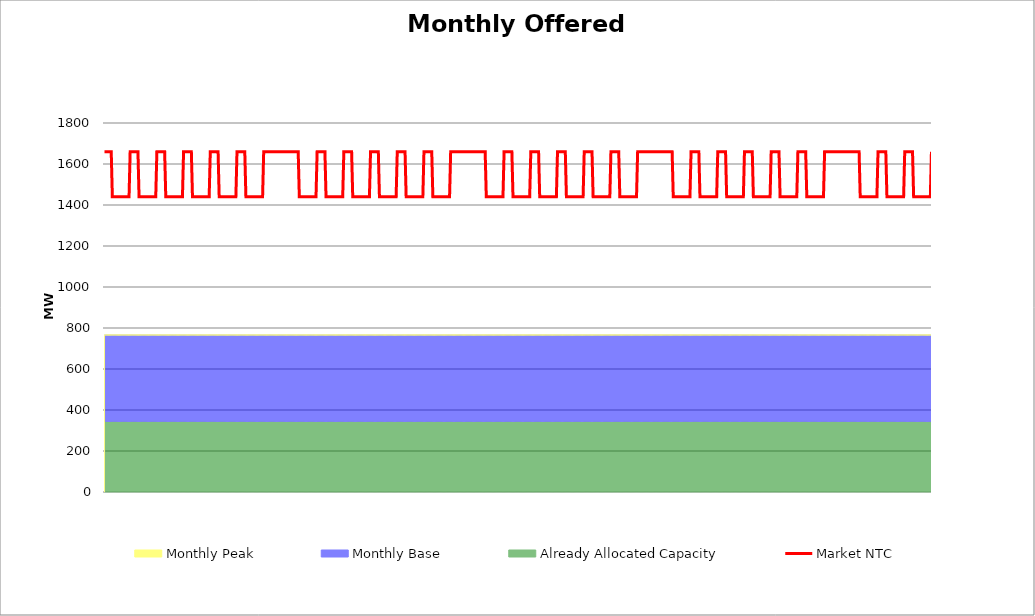
| Category | Market NTC |
|---|---|
| 0 | 1660 |
| 1 | 1660 |
| 2 | 1660 |
| 3 | 1660 |
| 4 | 1660 |
| 5 | 1660 |
| 6 | 1660 |
| 7 | 1440 |
| 8 | 1440 |
| 9 | 1440 |
| 10 | 1440 |
| 11 | 1440 |
| 12 | 1440 |
| 13 | 1440 |
| 14 | 1440 |
| 15 | 1440 |
| 16 | 1440 |
| 17 | 1440 |
| 18 | 1440 |
| 19 | 1440 |
| 20 | 1440 |
| 21 | 1440 |
| 22 | 1440 |
| 23 | 1660 |
| 24 | 1660 |
| 25 | 1660 |
| 26 | 1660 |
| 27 | 1660 |
| 28 | 1660 |
| 29 | 1660 |
| 30 | 1660 |
| 31 | 1440 |
| 32 | 1440 |
| 33 | 1440 |
| 34 | 1440 |
| 35 | 1440 |
| 36 | 1440 |
| 37 | 1440 |
| 38 | 1440 |
| 39 | 1440 |
| 40 | 1440 |
| 41 | 1440 |
| 42 | 1440 |
| 43 | 1440 |
| 44 | 1440 |
| 45 | 1440 |
| 46 | 1440 |
| 47 | 1660 |
| 48 | 1660 |
| 49 | 1660 |
| 50 | 1660 |
| 51 | 1660 |
| 52 | 1660 |
| 53 | 1660 |
| 54 | 1660 |
| 55 | 1440 |
| 56 | 1440 |
| 57 | 1440 |
| 58 | 1440 |
| 59 | 1440 |
| 60 | 1440 |
| 61 | 1440 |
| 62 | 1440 |
| 63 | 1440 |
| 64 | 1440 |
| 65 | 1440 |
| 66 | 1440 |
| 67 | 1440 |
| 68 | 1440 |
| 69 | 1440 |
| 70 | 1440 |
| 71 | 1660 |
| 72 | 1660 |
| 73 | 1660 |
| 74 | 1660 |
| 75 | 1660 |
| 76 | 1660 |
| 77 | 1660 |
| 78 | 1660 |
| 79 | 1440 |
| 80 | 1440 |
| 81 | 1440 |
| 82 | 1440 |
| 83 | 1440 |
| 84 | 1440 |
| 85 | 1440 |
| 86 | 1440 |
| 87 | 1440 |
| 88 | 1440 |
| 89 | 1440 |
| 90 | 1440 |
| 91 | 1440 |
| 92 | 1440 |
| 93 | 1440 |
| 94 | 1440 |
| 95 | 1660 |
| 96 | 1660 |
| 97 | 1660 |
| 98 | 1660 |
| 99 | 1660 |
| 100 | 1660 |
| 101 | 1660 |
| 102 | 1660 |
| 103 | 1440 |
| 104 | 1440 |
| 105 | 1440 |
| 106 | 1440 |
| 107 | 1440 |
| 108 | 1440 |
| 109 | 1440 |
| 110 | 1440 |
| 111 | 1440 |
| 112 | 1440 |
| 113 | 1440 |
| 114 | 1440 |
| 115 | 1440 |
| 116 | 1440 |
| 117 | 1440 |
| 118 | 1440 |
| 119 | 1660 |
| 120 | 1660 |
| 121 | 1660 |
| 122 | 1660 |
| 123 | 1660 |
| 124 | 1660 |
| 125 | 1660 |
| 126 | 1660 |
| 127 | 1440 |
| 128 | 1440 |
| 129 | 1440 |
| 130 | 1440 |
| 131 | 1440 |
| 132 | 1440 |
| 133 | 1440 |
| 134 | 1440 |
| 135 | 1440 |
| 136 | 1440 |
| 137 | 1440 |
| 138 | 1440 |
| 139 | 1440 |
| 140 | 1440 |
| 141 | 1440 |
| 142 | 1440 |
| 143 | 1660 |
| 144 | 1660 |
| 145 | 1660 |
| 146 | 1660 |
| 147 | 1660 |
| 148 | 1660 |
| 149 | 1660 |
| 150 | 1660 |
| 151 | 1660 |
| 152 | 1660 |
| 153 | 1660 |
| 154 | 1660 |
| 155 | 1660 |
| 156 | 1660 |
| 157 | 1660 |
| 158 | 1660 |
| 159 | 1660 |
| 160 | 1660 |
| 161 | 1660 |
| 162 | 1660 |
| 163 | 1660 |
| 164 | 1660 |
| 165 | 1660 |
| 166 | 1660 |
| 167 | 1660 |
| 168 | 1660 |
| 169 | 1660 |
| 170 | 1660 |
| 171 | 1660 |
| 172 | 1660 |
| 173 | 1660 |
| 174 | 1660 |
| 175 | 1440 |
| 176 | 1440 |
| 177 | 1440 |
| 178 | 1440 |
| 179 | 1440 |
| 180 | 1440 |
| 181 | 1440 |
| 182 | 1440 |
| 183 | 1440 |
| 184 | 1440 |
| 185 | 1440 |
| 186 | 1440 |
| 187 | 1440 |
| 188 | 1440 |
| 189 | 1440 |
| 190 | 1440 |
| 191 | 1660 |
| 192 | 1660 |
| 193 | 1660 |
| 194 | 1660 |
| 195 | 1660 |
| 196 | 1660 |
| 197 | 1660 |
| 198 | 1660 |
| 199 | 1440 |
| 200 | 1440 |
| 201 | 1440 |
| 202 | 1440 |
| 203 | 1440 |
| 204 | 1440 |
| 205 | 1440 |
| 206 | 1440 |
| 207 | 1440 |
| 208 | 1440 |
| 209 | 1440 |
| 210 | 1440 |
| 211 | 1440 |
| 212 | 1440 |
| 213 | 1440 |
| 214 | 1440 |
| 215 | 1660 |
| 216 | 1660 |
| 217 | 1660 |
| 218 | 1660 |
| 219 | 1660 |
| 220 | 1660 |
| 221 | 1660 |
| 222 | 1660 |
| 223 | 1440 |
| 224 | 1440 |
| 225 | 1440 |
| 226 | 1440 |
| 227 | 1440 |
| 228 | 1440 |
| 229 | 1440 |
| 230 | 1440 |
| 231 | 1440 |
| 232 | 1440 |
| 233 | 1440 |
| 234 | 1440 |
| 235 | 1440 |
| 236 | 1440 |
| 237 | 1440 |
| 238 | 1440 |
| 239 | 1660 |
| 240 | 1660 |
| 241 | 1660 |
| 242 | 1660 |
| 243 | 1660 |
| 244 | 1660 |
| 245 | 1660 |
| 246 | 1660 |
| 247 | 1440 |
| 248 | 1440 |
| 249 | 1440 |
| 250 | 1440 |
| 251 | 1440 |
| 252 | 1440 |
| 253 | 1440 |
| 254 | 1440 |
| 255 | 1440 |
| 256 | 1440 |
| 257 | 1440 |
| 258 | 1440 |
| 259 | 1440 |
| 260 | 1440 |
| 261 | 1440 |
| 262 | 1440 |
| 263 | 1660 |
| 264 | 1660 |
| 265 | 1660 |
| 266 | 1660 |
| 267 | 1660 |
| 268 | 1660 |
| 269 | 1660 |
| 270 | 1660 |
| 271 | 1440 |
| 272 | 1440 |
| 273 | 1440 |
| 274 | 1440 |
| 275 | 1440 |
| 276 | 1440 |
| 277 | 1440 |
| 278 | 1440 |
| 279 | 1440 |
| 280 | 1440 |
| 281 | 1440 |
| 282 | 1440 |
| 283 | 1440 |
| 284 | 1440 |
| 285 | 1440 |
| 286 | 1440 |
| 287 | 1660 |
| 288 | 1660 |
| 289 | 1660 |
| 290 | 1660 |
| 291 | 1660 |
| 292 | 1660 |
| 293 | 1660 |
| 294 | 1660 |
| 295 | 1440 |
| 296 | 1440 |
| 297 | 1440 |
| 298 | 1440 |
| 299 | 1440 |
| 300 | 1440 |
| 301 | 1440 |
| 302 | 1440 |
| 303 | 1440 |
| 304 | 1440 |
| 305 | 1440 |
| 306 | 1440 |
| 307 | 1440 |
| 308 | 1440 |
| 309 | 1440 |
| 310 | 1440 |
| 311 | 1660 |
| 312 | 1660 |
| 313 | 1660 |
| 314 | 1660 |
| 315 | 1660 |
| 316 | 1660 |
| 317 | 1660 |
| 318 | 1660 |
| 319 | 1660 |
| 320 | 1660 |
| 321 | 1660 |
| 322 | 1660 |
| 323 | 1660 |
| 324 | 1660 |
| 325 | 1660 |
| 326 | 1660 |
| 327 | 1660 |
| 328 | 1660 |
| 329 | 1660 |
| 330 | 1660 |
| 331 | 1660 |
| 332 | 1660 |
| 333 | 1660 |
| 334 | 1660 |
| 335 | 1660 |
| 336 | 1660 |
| 337 | 1660 |
| 338 | 1660 |
| 339 | 1660 |
| 340 | 1660 |
| 341 | 1660 |
| 342 | 1660 |
| 343 | 1440 |
| 344 | 1440 |
| 345 | 1440 |
| 346 | 1440 |
| 347 | 1440 |
| 348 | 1440 |
| 349 | 1440 |
| 350 | 1440 |
| 351 | 1440 |
| 352 | 1440 |
| 353 | 1440 |
| 354 | 1440 |
| 355 | 1440 |
| 356 | 1440 |
| 357 | 1440 |
| 358 | 1440 |
| 359 | 1660 |
| 360 | 1660 |
| 361 | 1660 |
| 362 | 1660 |
| 363 | 1660 |
| 364 | 1660 |
| 365 | 1660 |
| 366 | 1660 |
| 367 | 1440 |
| 368 | 1440 |
| 369 | 1440 |
| 370 | 1440 |
| 371 | 1440 |
| 372 | 1440 |
| 373 | 1440 |
| 374 | 1440 |
| 375 | 1440 |
| 376 | 1440 |
| 377 | 1440 |
| 378 | 1440 |
| 379 | 1440 |
| 380 | 1440 |
| 381 | 1440 |
| 382 | 1440 |
| 383 | 1660 |
| 384 | 1660 |
| 385 | 1660 |
| 386 | 1660 |
| 387 | 1660 |
| 388 | 1660 |
| 389 | 1660 |
| 390 | 1660 |
| 391 | 1440 |
| 392 | 1440 |
| 393 | 1440 |
| 394 | 1440 |
| 395 | 1440 |
| 396 | 1440 |
| 397 | 1440 |
| 398 | 1440 |
| 399 | 1440 |
| 400 | 1440 |
| 401 | 1440 |
| 402 | 1440 |
| 403 | 1440 |
| 404 | 1440 |
| 405 | 1440 |
| 406 | 1440 |
| 407 | 1660 |
| 408 | 1660 |
| 409 | 1660 |
| 410 | 1660 |
| 411 | 1660 |
| 412 | 1660 |
| 413 | 1660 |
| 414 | 1660 |
| 415 | 1440 |
| 416 | 1440 |
| 417 | 1440 |
| 418 | 1440 |
| 419 | 1440 |
| 420 | 1440 |
| 421 | 1440 |
| 422 | 1440 |
| 423 | 1440 |
| 424 | 1440 |
| 425 | 1440 |
| 426 | 1440 |
| 427 | 1440 |
| 428 | 1440 |
| 429 | 1440 |
| 430 | 1440 |
| 431 | 1660 |
| 432 | 1660 |
| 433 | 1660 |
| 434 | 1660 |
| 435 | 1660 |
| 436 | 1660 |
| 437 | 1660 |
| 438 | 1660 |
| 439 | 1440 |
| 440 | 1440 |
| 441 | 1440 |
| 442 | 1440 |
| 443 | 1440 |
| 444 | 1440 |
| 445 | 1440 |
| 446 | 1440 |
| 447 | 1440 |
| 448 | 1440 |
| 449 | 1440 |
| 450 | 1440 |
| 451 | 1440 |
| 452 | 1440 |
| 453 | 1440 |
| 454 | 1440 |
| 455 | 1660 |
| 456 | 1660 |
| 457 | 1660 |
| 458 | 1660 |
| 459 | 1660 |
| 460 | 1660 |
| 461 | 1660 |
| 462 | 1660 |
| 463 | 1440 |
| 464 | 1440 |
| 465 | 1440 |
| 466 | 1440 |
| 467 | 1440 |
| 468 | 1440 |
| 469 | 1440 |
| 470 | 1440 |
| 471 | 1440 |
| 472 | 1440 |
| 473 | 1440 |
| 474 | 1440 |
| 475 | 1440 |
| 476 | 1440 |
| 477 | 1440 |
| 478 | 1440 |
| 479 | 1660 |
| 480 | 1660 |
| 481 | 1660 |
| 482 | 1660 |
| 483 | 1660 |
| 484 | 1660 |
| 485 | 1660 |
| 486 | 1660 |
| 487 | 1660 |
| 488 | 1660 |
| 489 | 1660 |
| 490 | 1660 |
| 491 | 1660 |
| 492 | 1660 |
| 493 | 1660 |
| 494 | 1660 |
| 495 | 1660 |
| 496 | 1660 |
| 497 | 1660 |
| 498 | 1660 |
| 499 | 1660 |
| 500 | 1660 |
| 501 | 1660 |
| 502 | 1660 |
| 503 | 1660 |
| 504 | 1660 |
| 505 | 1660 |
| 506 | 1660 |
| 507 | 1660 |
| 508 | 1660 |
| 509 | 1660 |
| 510 | 1660 |
| 511 | 1440 |
| 512 | 1440 |
| 513 | 1440 |
| 514 | 1440 |
| 515 | 1440 |
| 516 | 1440 |
| 517 | 1440 |
| 518 | 1440 |
| 519 | 1440 |
| 520 | 1440 |
| 521 | 1440 |
| 522 | 1440 |
| 523 | 1440 |
| 524 | 1440 |
| 525 | 1440 |
| 526 | 1440 |
| 527 | 1660 |
| 528 | 1660 |
| 529 | 1660 |
| 530 | 1660 |
| 531 | 1660 |
| 532 | 1660 |
| 533 | 1660 |
| 534 | 1660 |
| 535 | 1440 |
| 536 | 1440 |
| 537 | 1440 |
| 538 | 1440 |
| 539 | 1440 |
| 540 | 1440 |
| 541 | 1440 |
| 542 | 1440 |
| 543 | 1440 |
| 544 | 1440 |
| 545 | 1440 |
| 546 | 1440 |
| 547 | 1440 |
| 548 | 1440 |
| 549 | 1440 |
| 550 | 1440 |
| 551 | 1660 |
| 552 | 1660 |
| 553 | 1660 |
| 554 | 1660 |
| 555 | 1660 |
| 556 | 1660 |
| 557 | 1660 |
| 558 | 1660 |
| 559 | 1440 |
| 560 | 1440 |
| 561 | 1440 |
| 562 | 1440 |
| 563 | 1440 |
| 564 | 1440 |
| 565 | 1440 |
| 566 | 1440 |
| 567 | 1440 |
| 568 | 1440 |
| 569 | 1440 |
| 570 | 1440 |
| 571 | 1440 |
| 572 | 1440 |
| 573 | 1440 |
| 574 | 1440 |
| 575 | 1660 |
| 576 | 1660 |
| 577 | 1660 |
| 578 | 1660 |
| 579 | 1660 |
| 580 | 1660 |
| 581 | 1660 |
| 582 | 1660 |
| 583 | 1440 |
| 584 | 1440 |
| 585 | 1440 |
| 586 | 1440 |
| 587 | 1440 |
| 588 | 1440 |
| 589 | 1440 |
| 590 | 1440 |
| 591 | 1440 |
| 592 | 1440 |
| 593 | 1440 |
| 594 | 1440 |
| 595 | 1440 |
| 596 | 1440 |
| 597 | 1440 |
| 598 | 1440 |
| 599 | 1660 |
| 600 | 1660 |
| 601 | 1660 |
| 602 | 1660 |
| 603 | 1660 |
| 604 | 1660 |
| 605 | 1660 |
| 606 | 1660 |
| 607 | 1440 |
| 608 | 1440 |
| 609 | 1440 |
| 610 | 1440 |
| 611 | 1440 |
| 612 | 1440 |
| 613 | 1440 |
| 614 | 1440 |
| 615 | 1440 |
| 616 | 1440 |
| 617 | 1440 |
| 618 | 1440 |
| 619 | 1440 |
| 620 | 1440 |
| 621 | 1440 |
| 622 | 1440 |
| 623 | 1660 |
| 624 | 1660 |
| 625 | 1660 |
| 626 | 1660 |
| 627 | 1660 |
| 628 | 1660 |
| 629 | 1660 |
| 630 | 1660 |
| 631 | 1440 |
| 632 | 1440 |
| 633 | 1440 |
| 634 | 1440 |
| 635 | 1440 |
| 636 | 1440 |
| 637 | 1440 |
| 638 | 1440 |
| 639 | 1440 |
| 640 | 1440 |
| 641 | 1440 |
| 642 | 1440 |
| 643 | 1440 |
| 644 | 1440 |
| 645 | 1440 |
| 646 | 1440 |
| 647 | 1660 |
| 648 | 1660 |
| 649 | 1660 |
| 650 | 1660 |
| 651 | 1660 |
| 652 | 1660 |
| 653 | 1660 |
| 654 | 1660 |
| 655 | 1660 |
| 656 | 1660 |
| 657 | 1660 |
| 658 | 1660 |
| 659 | 1660 |
| 660 | 1660 |
| 661 | 1660 |
| 662 | 1660 |
| 663 | 1660 |
| 664 | 1660 |
| 665 | 1660 |
| 666 | 1660 |
| 667 | 1660 |
| 668 | 1660 |
| 669 | 1660 |
| 670 | 1660 |
| 671 | 1660 |
| 672 | 1660 |
| 673 | 1660 |
| 674 | 1660 |
| 675 | 1660 |
| 676 | 1660 |
| 677 | 1660 |
| 678 | 1660 |
| 679 | 1440 |
| 680 | 1440 |
| 681 | 1440 |
| 682 | 1440 |
| 683 | 1440 |
| 684 | 1440 |
| 685 | 1440 |
| 686 | 1440 |
| 687 | 1440 |
| 688 | 1440 |
| 689 | 1440 |
| 690 | 1440 |
| 691 | 1440 |
| 692 | 1440 |
| 693 | 1440 |
| 694 | 1440 |
| 695 | 1660 |
| 696 | 1660 |
| 697 | 1660 |
| 698 | 1660 |
| 699 | 1660 |
| 700 | 1660 |
| 701 | 1660 |
| 702 | 1660 |
| 703 | 1440 |
| 704 | 1440 |
| 705 | 1440 |
| 706 | 1440 |
| 707 | 1440 |
| 708 | 1440 |
| 709 | 1440 |
| 710 | 1440 |
| 711 | 1440 |
| 712 | 1440 |
| 713 | 1440 |
| 714 | 1440 |
| 715 | 1440 |
| 716 | 1440 |
| 717 | 1440 |
| 718 | 1440 |
| 719 | 1660 |
| 720 | 1660 |
| 721 | 1660 |
| 722 | 1660 |
| 723 | 1660 |
| 724 | 1660 |
| 725 | 1660 |
| 726 | 1660 |
| 727 | 1440 |
| 728 | 1440 |
| 729 | 1440 |
| 730 | 1440 |
| 731 | 1440 |
| 732 | 1440 |
| 733 | 1440 |
| 734 | 1440 |
| 735 | 1440 |
| 736 | 1440 |
| 737 | 1440 |
| 738 | 1440 |
| 739 | 1440 |
| 740 | 1440 |
| 741 | 1440 |
| 742 | 1440 |
| 743 | 1660 |